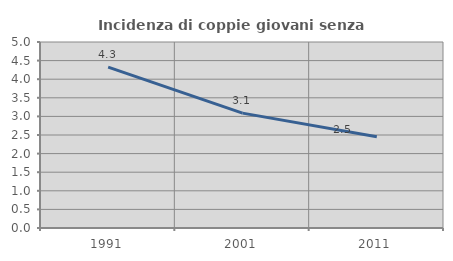
| Category | Incidenza di coppie giovani senza figli |
|---|---|
| 1991.0 | 4.325 |
| 2001.0 | 3.087 |
| 2011.0 | 2.452 |